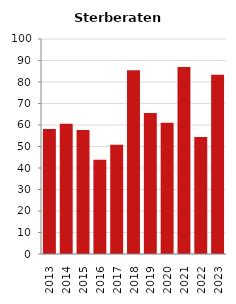
| Category | Sterberate der Bevölkerung ab 80 Jahre (auf Tsd.) |
|---|---|
| 2013.0 | 58.14 |
| 2014.0 | 60.606 |
| 2015.0 | 57.692 |
| 2016.0 | 43.86 |
| 2017.0 | 50.847 |
| 2018.0 | 85.47 |
| 2019.0 | 65.574 |
| 2020.0 | 61.069 |
| 2021.0 | 86.957 |
| 2022.0 | 54.422 |
| 2023.0 | 83.333 |